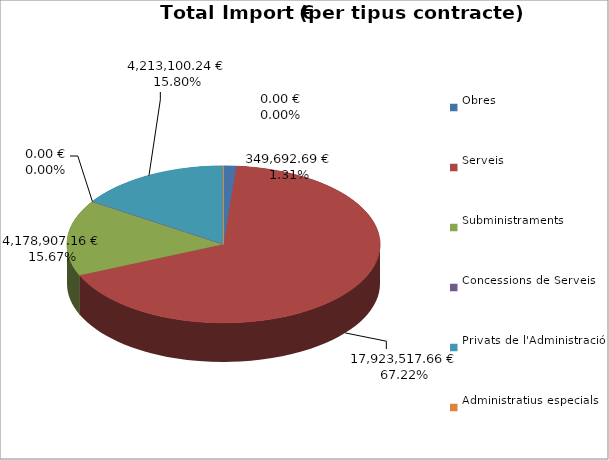
| Category | Total preu
(amb IVA) |
|---|---|
| Obres | 349692.69 |
| Serveis | 17923517.66 |
| Subministraments | 4178907.16 |
| Concessions de Serveis | 0 |
| Privats de l'Administració | 4213100.24 |
| Administratius especials | 0 |